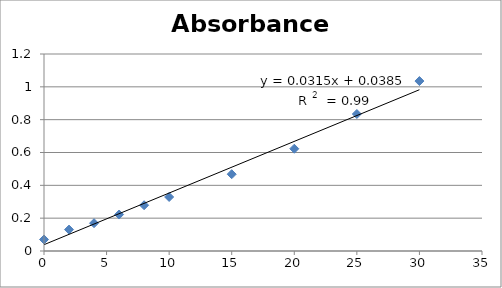
| Category | Absorbance  |
|---|---|
| 30.0 | 1.035 |
| 25.0 | 0.834 |
| 20.0 | 0.623 |
| 15.0 | 0.468 |
| 10.0 | 0.329 |
| 8.0 | 0.279 |
| 6.0 | 0.222 |
| 4.0 | 0.17 |
| 2.0 | 0.13 |
| 0.0 | 0.07 |